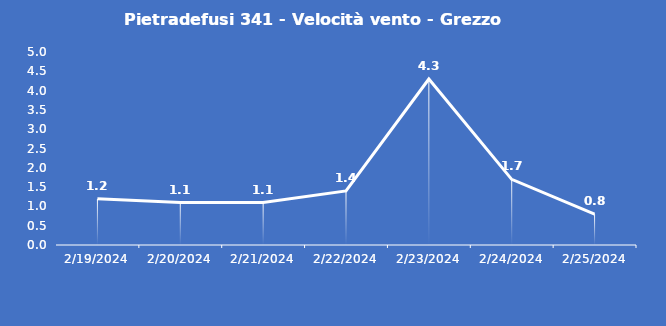
| Category | Pietradefusi 341 - Velocità vento - Grezzo (m/s) |
|---|---|
| 2/19/24 | 1.2 |
| 2/20/24 | 1.1 |
| 2/21/24 | 1.1 |
| 2/22/24 | 1.4 |
| 2/23/24 | 4.3 |
| 2/24/24 | 1.7 |
| 2/25/24 | 0.8 |